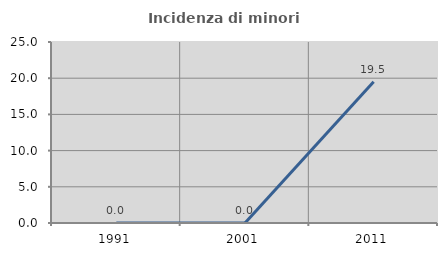
| Category | Incidenza di minori stranieri |
|---|---|
| 1991.0 | 0 |
| 2001.0 | 0 |
| 2011.0 | 19.512 |